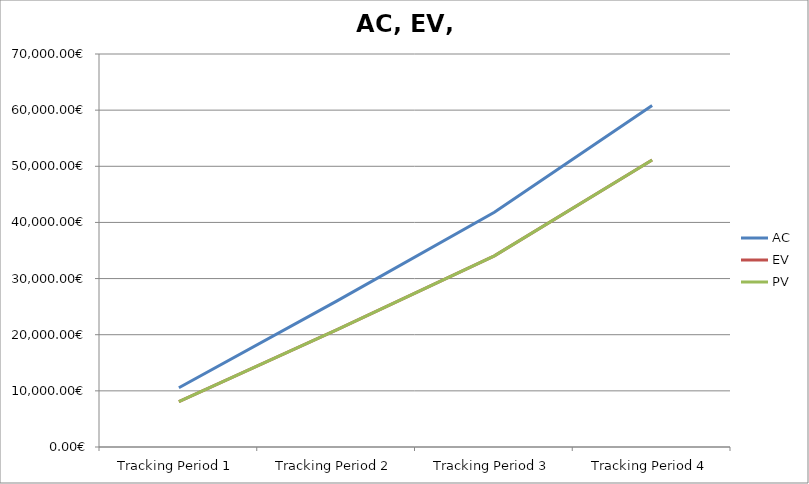
| Category | AC | EV | PV |
|---|---|---|---|
| Tracking Period 1 | 10544.52 | 8068.52 | 8068.52 |
| Tracking Period 2 | 25989.83 | 20841.83 | 20841.83 |
| Tracking Period 3 | 41815.47 | 34038.47 | 34038.47 |
| Tracking Period 4 | 60829.52 | 51115.52 | 51115.52 |